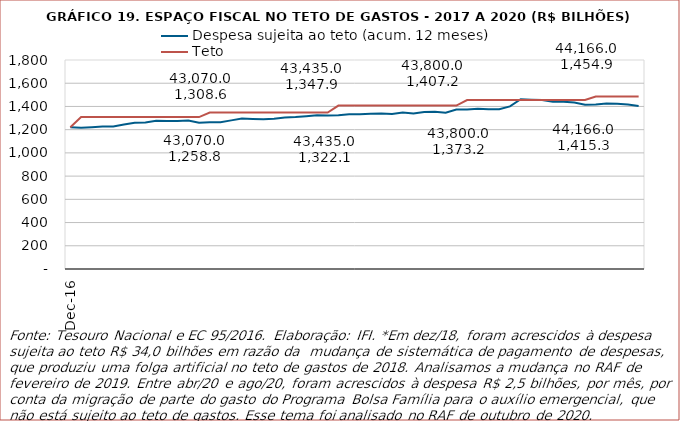
| Category | Despesa sujeita ao teto (acum. 12 meses) | Teto |
|---|---|---|
| 2016-12-01 | 1221128.813 | 1221128.813 |
| 2017-01-01 | 1217290.786 | 1308622 |
| 2017-02-01 | 1221600.253 | 1308622 |
| 2017-03-01 | 1226964.919 | 1308622 |
| 2017-04-01 | 1227869.478 | 1308622 |
| 2017-05-01 | 1244125.536 | 1308622 |
| 2017-06-01 | 1260356.642 | 1308622 |
| 2017-07-01 | 1261663.636 | 1308622 |
| 2017-08-01 | 1276310.469 | 1308622 |
| 2017-09-01 | 1275314.643 | 1308622 |
| 2017-10-01 | 1274821.494 | 1308622 |
| 2017-11-01 | 1279134.138 | 1308622 |
| 2017-12-01 | 1258818.252 | 1308622 |
| 2018-01-01 | 1262847.07 | 1347880.652 |
| 2018-02-01 | 1263625.026 | 1347880.652 |
| 2018-03-01 | 1280000.181 | 1347880.652 |
| 2018-04-01 | 1296332.072 | 1347880.652 |
| 2018-05-01 | 1292533.915 | 1347880.652 |
| 2018-06-01 | 1289598.742 | 1347880.652 |
| 2018-07-01 | 1293800.185 | 1347880.652 |
| 2018-08-01 | 1304758.121 | 1347880.652 |
| 2018-09-01 | 1309270.671 | 1347880.652 |
| 2018-10-01 | 1315880.847 | 1347880.652 |
| 2018-11-01 | 1324470.022 | 1347880.652 |
| 2018-12-01 | 1322071.49 | 1347880.652 |
| 2019-01-01 | 1325113.624 | 1407173.7 |
| 2019-02-01 | 1331750.977 | 1407173.7 |
| 2019-03-01 | 1332069.151 | 1407173.7 |
| 2019-04-01 | 1338036.963 | 1407173.7 |
| 2019-05-01 | 1340115.359 | 1407173.7 |
| 2019-06-01 | 1334291.067 | 1407173.7 |
| 2019-07-01 | 1346755.289 | 1407173.7 |
| 2019-08-01 | 1338311.27 | 1407173.7 |
| 2019-09-01 | 1352238.806 | 1407173.7 |
| 2019-10-01 | 1354412.797 | 1407173.7 |
| 2019-11-01 | 1345572.476 | 1407173.7 |
| 2019-12-01 | 1373228.668 | 1407173.7 |
| 2020-01-01 | 1374140.367 | 1454946.1 |
| 2020-02-01 | 1379266.98 | 1454946.1 |
| 2020-03-01 | 1375561.626 | 1454946.1 |
| 2020-04-01 | 1376225.208 | 1454946.1 |
| 2020-05-01 | 1400480.618 | 1454946.1 |
| 2020-06-01 | 1461670.005 | 1454946.1 |
| 2020-07-01 | 1458329.263 | 1454946.1 |
| 2020-08-01 | 1454629.04 | 1454946.1 |
| 2020-09-01 | 1440207.075 | 1454946.1 |
| 2020-10-01 | 1440164.547 | 1454946.1 |
| 2020-11-01 | 1433205.584 | 1454946.1 |
| 2020-12-01 | 1415318.174 | 1454946.1 |
| 2021-01-01 | 1417605.991 | 1485936.445 |
| 2021-02-01 | 1425215.87 | 1485936.445 |
| 2021-03-01 | 1424120.839 | 1485936.445 |
| 2021-04-01 | 1416448.852 | 1485936.445 |
| 2021-05-01 | 1404508.597 | 1485936.445 |